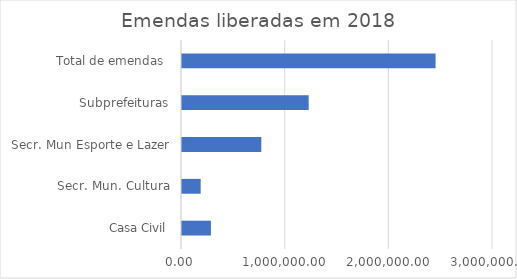
| Category | Series 0 |
|---|---|
| Casa Civil | 279000 |
| Secr. Mun. Cultura | 180000 |
| Secr. Mun Esporte e Lazer | 765000 |
| Subprefeituras | 1222000 |
| Total de emendas  | 2446000 |